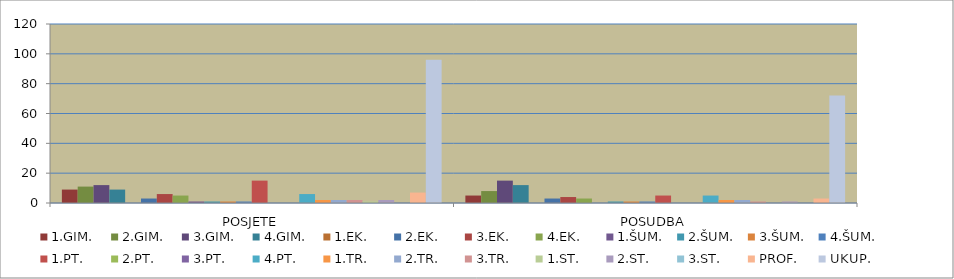
| Category | Stupac2 | 1.GIM. | 2.GIM. | 3.GIM. | 4.GIM. | 1.EK. | 2.EK. | 3.EK. | 4.EK. | 1.ŠUM. | 2.ŠUM. | 3.ŠUM. | 4.ŠUM. | 1.PT. | 2.PT. | 3.PT. | 4.PT. | 1.TR. | 2.TR. | 3.TR. | 1.ST. | 2.ST. | 3.ST. | PROF. | UKUP. |
|---|---|---|---|---|---|---|---|---|---|---|---|---|---|---|---|---|---|---|---|---|---|---|---|---|---|
| POSJETE |  | 9 | 11 | 12 | 9 | 0 | 3 | 6 | 5 | 1 | 1 | 1 | 1 | 15 | 0 | 0 | 6 | 2 | 2 | 2 | 1 | 2 | 0 | 7 | 96 |
| POSUDBA |  | 5 | 8 | 15 | 12 | 0 | 3 | 4 | 3 | 0 | 1 | 1 | 1 | 5 | 0 | 0 | 5 | 2 | 2 | 1 | 0 | 1 | 0 | 3 | 72 |